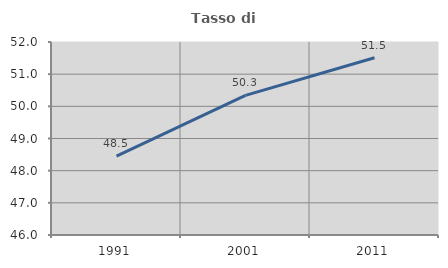
| Category | Tasso di occupazione   |
|---|---|
| 1991.0 | 48.455 |
| 2001.0 | 50.34 |
| 2011.0 | 51.509 |